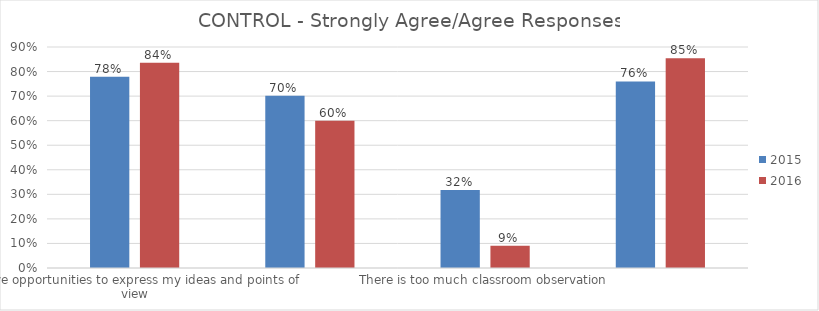
| Category | 2015 | 2016 |
|---|---|---|
| I have opportunities to express my ideas and points of view | 0.779 | 0.836 |
| I have to neglect some tasks because I have too much to do | 0.702 | 0.6 |
| There is too much classroom observation | 0.317 | 0.091 |
| I am encouraged to use my skills and initiative to do my work | 0.76 | 0.855 |